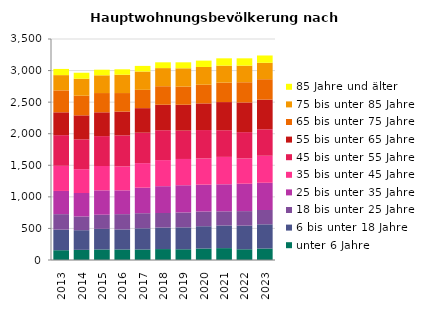
| Category | unter 6 Jahre | 6 bis unter 18 Jahre | 18 bis unter 25 Jahre | 25 bis unter 35 Jahre | 35 bis unter 45 Jahre | 45 bis unter 55 Jahre | 55 bis unter 65 Jahre | 65 bis unter 75 Jahre | 75 bis unter 85 Jahre | 85 Jahre und älter |
|---|---|---|---|---|---|---|---|---|---|---|
| 2013.0 | 155 | 326 | 245 | 368 | 398 | 485 | 362 | 347 | 242 | 98 |
| 2014.0 | 161 | 311 | 218 | 371 | 377 | 473 | 380 | 311 | 269 | 95 |
| 2015.0 | 167 | 326 | 224 | 386 | 386 | 473 | 377 | 305 | 281 | 89 |
| 2016.0 | 167 | 317 | 242 | 377 | 380 | 491 | 377 | 293 | 290 | 86 |
| 2017.0 | 167 | 335 | 239 | 404 | 389 | 482 | 389 | 290 | 290 | 89 |
| 2018.0 | 173 | 341 | 230 | 425 | 413 | 473 | 404 | 293 | 287 | 92 |
| 2019.0 | 170 | 347 | 236 | 431 | 416 | 449 | 410 | 287 | 290 | 95 |
| 2020.0 | 182 | 353 | 233 | 425 | 416 | 449 | 422 | 296 | 281 | 101 |
| 2021.0 | 188 | 359 | 224 | 428 | 434 | 422 | 446 | 308 | 269 | 116 |
| 2022.0 | 170 | 374 | 230 | 434 | 401 | 416 | 470 | 320 | 263 | 116 |
| 2023.0 | 182 | 383 | 227 | 431 | 428 | 419 | 470 | 323 | 260 | 116 |